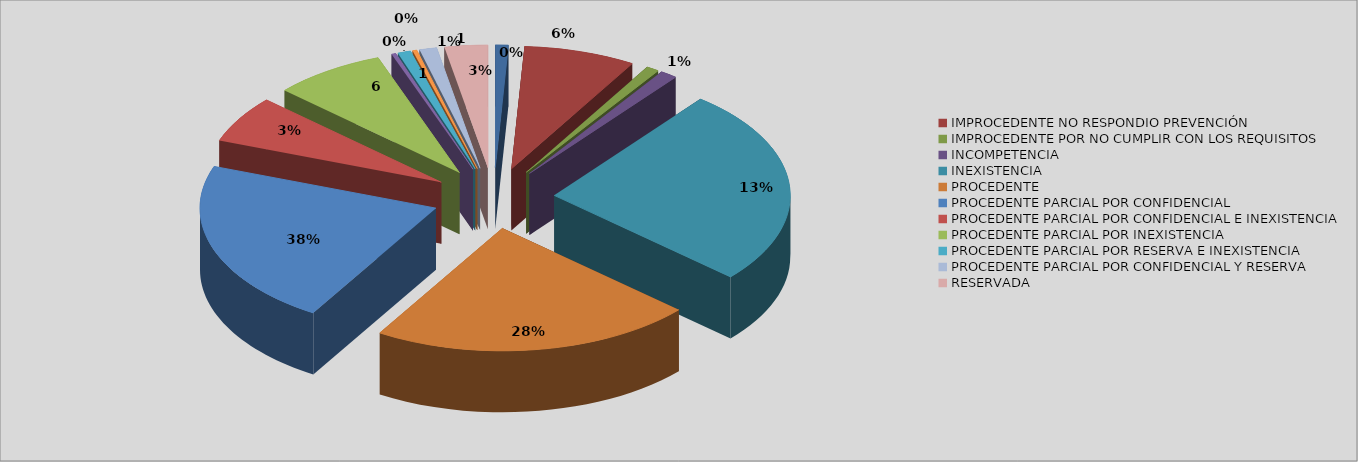
| Category | Series 0 | Series 1 |
|---|---|---|
| DESISTIMIENTO | 3 | 0.009 |
| IMPROCEDENTE NO RESPONDIO PREVENCIÓN | 26 | 0.077 |
| IMPROCEDENTE POR NO CUMPLIR CON LOS REQUISITOS | 3 | 0.009 |
| INCOMPETENCIA | 4 | 0.012 |
| INEXISTENCIA  | 88 | 0.26 |
| PROCEDENTE | 75 | 0.222 |
| PROCEDENTE PARCIAL POR CONFIDENCIAL | 74 | 0.219 |
| PROCEDENTE PARCIAL POR CONFIDENCIAL E INEXISTENCIA | 21 | 0.062 |
| PROCEDENTE PARCIAL POR INEXISTENCIA | 26 | 0.077 |
| PREVENCIÓN EN TRAMITE | 1 | 0.003 |
| PROCEDENTE PARCIAL POR RESERVA E INEXISTENCIA | 3 | 0.009 |
| IMPROCEDENTE POR RESERVA E INEXISTENCIA | 1 | 0.003 |
| PROCEDENTE PARCIAL POR CONFIDENCIAL Y RESERVA | 4 | 0.012 |
| RESERVADA | 10 | 0.03 |